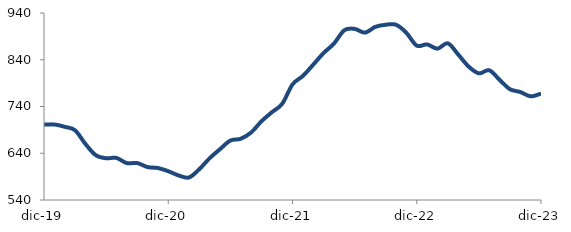
| Category | Series 0 |
|---|---|
| 2019-12-01 | 701.214 |
| 2020-01-01 | 701.517 |
| 2020-02-01 | 696.552 |
| 2020-03-01 | 689.099 |
| 2020-04-01 | 659.896 |
| 2020-05-01 | 635.894 |
| 2020-06-01 | 629.29 |
| 2020-07-01 | 629.994 |
| 2020-08-01 | 618.866 |
| 2020-09-01 | 619.022 |
| 2020-10-01 | 610.428 |
| 2020-11-01 | 608.402 |
| 2020-12-01 | 601.605 |
| 2021-01-01 | 592.504 |
| 2021-02-01 | 588.185 |
| 2021-03-01 | 605.989 |
| 2021-04-01 | 629.446 |
| 2021-05-01 | 648.73 |
| 2021-06-01 | 667.177 |
| 2021-07-01 | 670.996 |
| 2021-08-01 | 684.389 |
| 2021-09-01 | 708.308 |
| 2021-10-01 | 727.608 |
| 2021-11-01 | 745.65 |
| 2021-12-01 | 787.184 |
| 2022-01-01 | 805.308 |
| 2022-02-01 | 829.502 |
| 2022-03-01 | 854.336 |
| 2022-04-01 | 874.453 |
| 2022-05-01 | 903.049 |
| 2022-06-01 | 906.022 |
| 2022-07-01 | 898.071 |
| 2022-08-01 | 910.353 |
| 2022-09-01 | 914.859 |
| 2022-10-01 | 914.857 |
| 2022-11-01 | 897.607 |
| 2022-12-01 | 870.196 |
| 2023-01-01 | 872.784 |
| 2023-02-01 | 863.736 |
| 2023-03-01 | 875.118 |
| 2023-04-01 | 851.276 |
| 2023-05-01 | 825.667 |
| 2023-06-01 | 810.924 |
| 2023-07-01 | 817.469 |
| 2023-08-01 | 797.001 |
| 2023-09-01 | 777.024 |
| 2023-10-01 | 770.975 |
| 2023-11-01 | 761.798 |
| 2023-12-01 | 767.626 |